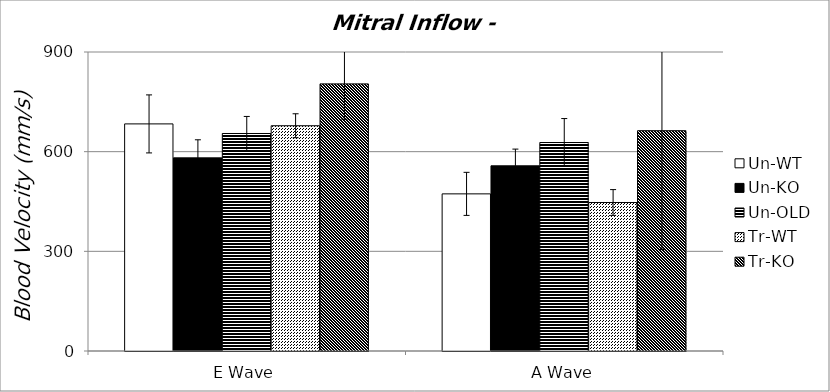
| Category | Un-WT | Un-KO | Un-OLD | Tr-WT | Tr-KO |
|---|---|---|---|---|---|
| 0 | 683.568 | 581.328 | 654.697 | 678.031 | 804.04 |
| 1 | 472.987 | 557.404 | 627.522 | 447.01 | 663.117 |